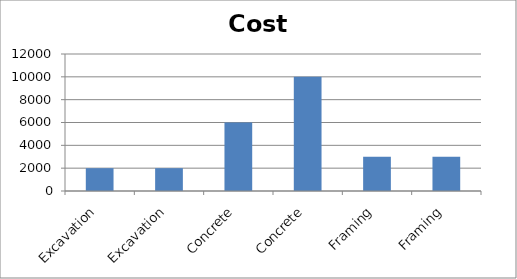
| Category | Cost |
|---|---|
| Excavation | 2000 |
| Excavation | 2000 |
| Concrete | 6000 |
| Concrete | 10000 |
| Framing | 3000 |
| Framing | 3000 |